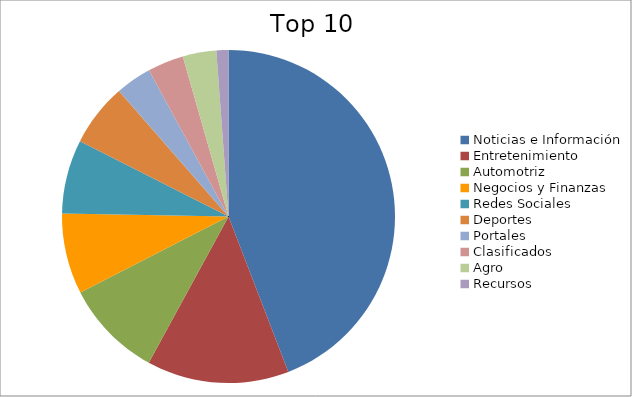
| Category | Series 0 |
|---|---|
| Noticias e Información | 42.73 |
| Entretenimiento | 13.35 |
| Automotriz | 9.21 |
| Negocios y Finanzas | 7.57 |
| Redes Sociales | 6.95 |
| Deportes | 5.91 |
| Portales | 3.39 |
| Clasificados | 3.39 |
| Agro | 3.15 |
| Recursos | 1.13 |